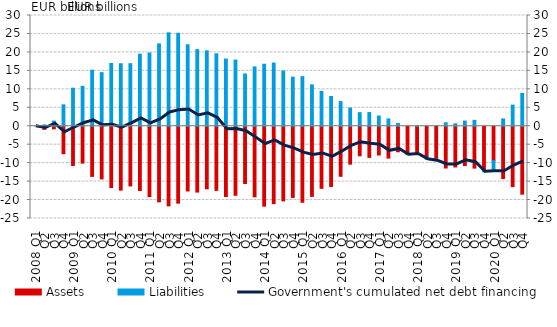
| Category | Assets | Liabilities |
|---|---|---|
| 2008 Q1 | 0 | 0 |
| Q2 | -0.851 | 0.372 |
| Q3 | -0.698 | 1.388 |
| Q4 | -7.444 | 5.798 |
| 2009 Q1 | -10.651 | 10.301 |
| Q2 | -9.986 | 10.798 |
| Q3 | -13.594 | 15.17 |
| Q4 | -14.283 | 14.52 |
| 2010 Q1 | -16.613 | 17.005 |
| Q2 | -17.314 | 16.929 |
| Q3 | -16.185 | 16.948 |
| Q4 | -17.416 | 19.527 |
| 2011 Q1 | -19.061 | 19.849 |
| Q2 | -20.485 | 22.309 |
| Q3 | -21.575 | 25.301 |
| Q4 | -20.841 | 25.195 |
| 2012 Q1 | -17.539 | 22.066 |
| Q2 | -17.847 | 20.761 |
| Q3 | -16.951 | 20.433 |
| Q4 | -17.379 | 19.629 |
| 2013 Q1 | -19.043 | 18.207 |
| Q2 | -18.703 | 17.929 |
| Q3 | -15.515 | 14.165 |
| Q4 | -19.124 | 16.074 |
| 2014 Q1 | -21.656 | 16.791 |
| Q2 | -20.959 | 17.124 |
| Q3 | -20.221 | 14.972 |
| Q4 | -19.295 | 13.303 |
| 2015 Q1 | -20.605 | 13.44 |
| Q2 | -19.008 | 11.22 |
| Q3 | -16.826 | 9.454 |
| Q4 | -16.33 | 8.051 |
| 2016 Q1 | -13.559 | 6.668 |
| Q2 | -10.267 | 4.929 |
| Q3 | -8.014 | 3.69 |
| Q4 | -8.453 | 3.701 |
| 2017 Q1 | -7.794 | 2.764 |
| Q2 | -8.643 | 1.985 |
| Q3 | -6.917 | 0.76 |
| Q4 | -7.651 | -0.06 |
| 2018 Q1 | -7.553 | 0.022 |
| Q2 | -8.353 | -0.577 |
| Q3 | -8.827 | -0.501 |
| Q4 | -11.319 | 0.947 |
| 2019 Q1 | -11.034 | 0.681 |
| Q2 | -10.662 | 1.404 |
| Q3 | -11.346 | 1.585 |
| Q4 | -11.85 | -0.492 |
| 2020 Q1 | -9.324 | -2.889 |
| Q2 | -14.184 | 1.979 |
| Q3 | -16.363 | 5.717 |
| Q4 | -18.407 | 8.887 |